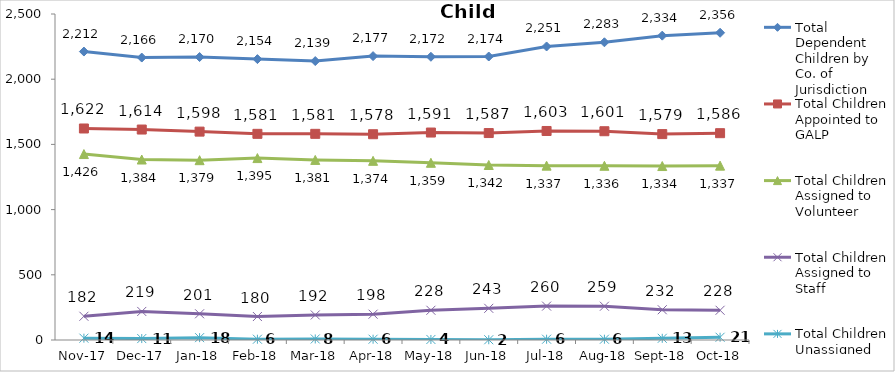
| Category | Total Dependent Children by Co. of Jurisdiction | Total Children Appointed to GALP | Total Children Assigned to Volunteer | Total Children Assigned to Staff | Total Children Unassigned |
|---|---|---|---|---|---|
| 2017-11-01 | 2212 | 1622 | 1426 | 182 | 14 |
| 2017-12-01 | 2166 | 1614 | 1384 | 219 | 11 |
| 2018-01-01 | 2170 | 1598 | 1379 | 201 | 18 |
| 2018-02-01 | 2154 | 1581 | 1395 | 180 | 6 |
| 2018-03-01 | 2139 | 1581 | 1381 | 192 | 8 |
| 2018-04-01 | 2177 | 1578 | 1374 | 198 | 6 |
| 2018-05-01 | 2172 | 1591 | 1359 | 228 | 4 |
| 2018-06-01 | 2174 | 1587 | 1342 | 243 | 2 |
| 2018-07-01 | 2251 | 1603 | 1337 | 260 | 6 |
| 2018-08-01 | 2283 | 1601 | 1336 | 259 | 6 |
| 2018-09-01 | 2334 | 1579 | 1334 | 232 | 13 |
| 2018-10-01 | 2356 | 1586 | 1337 | 228 | 21 |